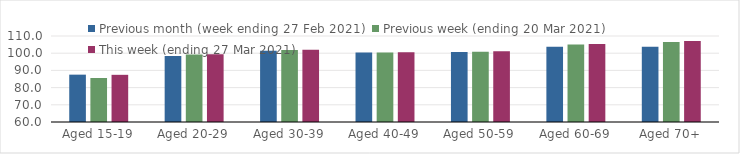
| Category | Previous month (week ending 27 Feb 2021) | Previous week (ending 20 Mar 2021) | This week (ending 27 Mar 2021) |
|---|---|---|---|
| Aged 15-19 | 87.53 | 85.59 | 87.43 |
| Aged 20-29 | 98.38 | 99.23 | 99.43 |
| Aged 30-39 | 101.4 | 101.89 | 101.97 |
| Aged 40-49 | 100.37 | 100.41 | 100.56 |
| Aged 50-59 | 100.72 | 100.9 | 101.09 |
| Aged 60-69 | 103.75 | 104.99 | 105.31 |
| Aged 70+ | 103.82 | 106.44 | 107.08 |